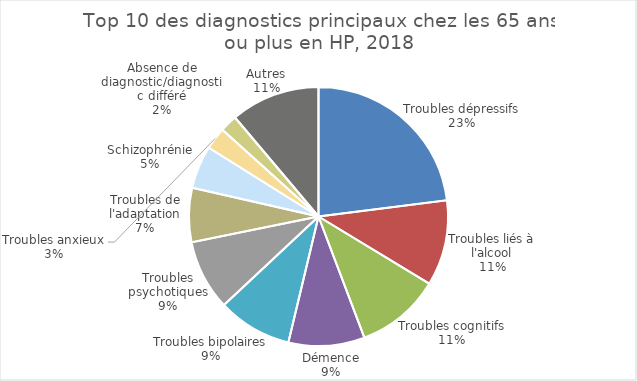
| Category | Fréquence |
|---|---|
| Troubles dépressifs | 1229 |
| Troubles liés à l'alcool | 571 |
| Troubles cognitifs | 564 |
| Démence | 508 |
| Troubles bipolaires | 496 |
| Troubles psychotiques | 469 |
| Troubles de l'adaptation | 361 |
| Schizophrénie | 286 |
| Troubles anxieux | 148 |
| Absence de diagnostic/diagnostic différé | 116 |
| Autres | 596 |